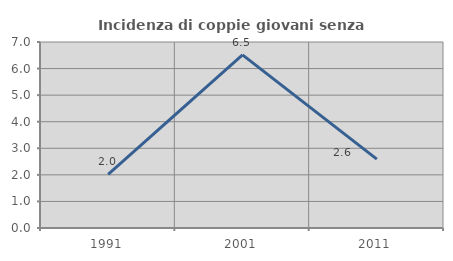
| Category | Incidenza di coppie giovani senza figli |
|---|---|
| 1991.0 | 2.016 |
| 2001.0 | 6.513 |
| 2011.0 | 2.593 |